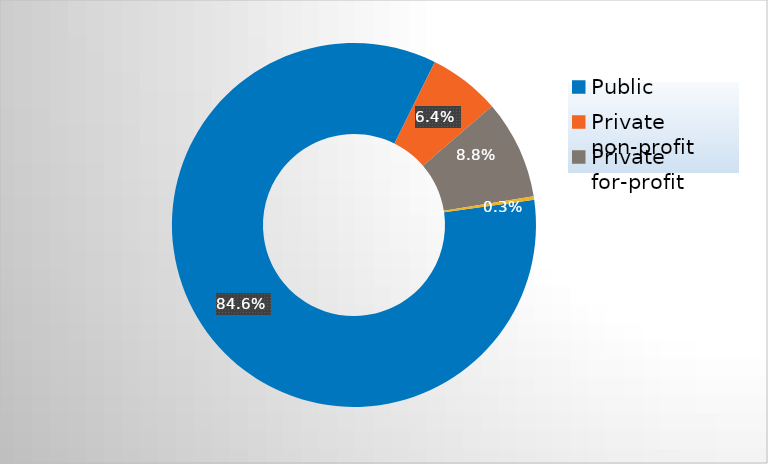
| Category | Series 0 |
|---|---|
| Public | 0.846 |
| Private non-profit | 0.064 |
| Private for-profit | 0.088 |
| Private, state-related | 0.003 |